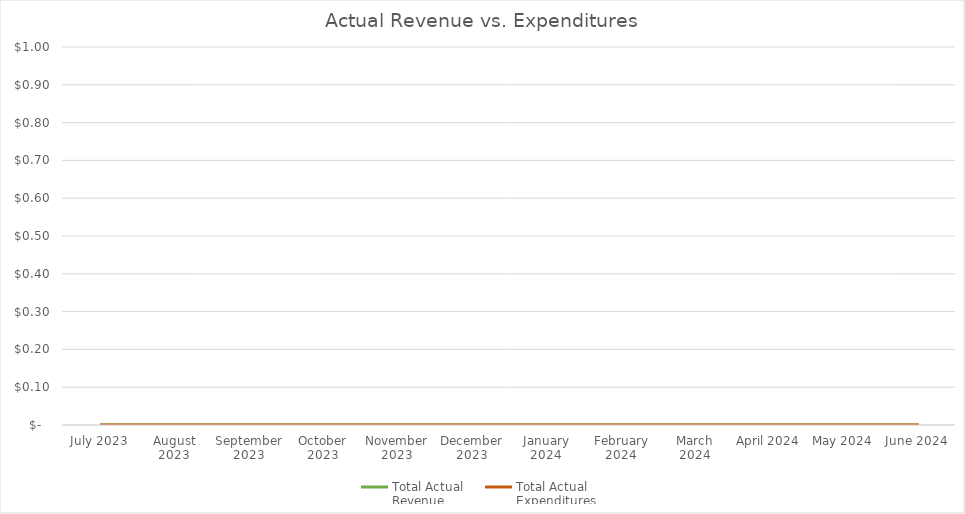
| Category | Total Actual 
Revenue | Total Actual 
Expenditures |
|---|---|---|
| July 2023 | 0 | 0 |
| August 2023 | 0 | 0 |
| September 2023 | 0 | 0 |
| October 2023 | 0 | 0 |
| November 2023 | 0 | 0 |
| December 2023 | 0 | 0 |
| January 2024 | 0 | 0 |
| February 2024 | 0 | 0 |
| March 2024 | 0 | 0 |
| April 2024 | 0 | 0 |
| May 2024 | 0 | 0 |
| June 2024 | 0 | 0 |